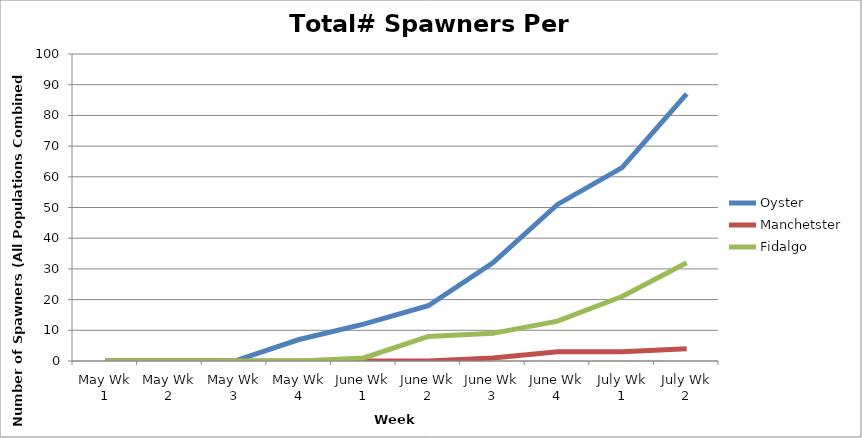
| Category | Oyster | Manchetster | Fidalgo |
|---|---|---|---|
| May Wk 1 | 0 | 0 | 0 |
| May Wk 2 | 0 | 0 | 0 |
| May Wk 3 | 0 | 0 | 0 |
| May Wk 4 | 7 | 0 | 0 |
| June Wk 1 | 12 | 0 | 1 |
| June Wk 2 | 18 | 0 | 8 |
| June Wk 3 | 32 | 1 | 9 |
| June Wk 4 | 51 | 3 | 13 |
| July Wk 1 | 63 | 3 | 21 |
| July Wk 2 | 87 | 4 | 32 |